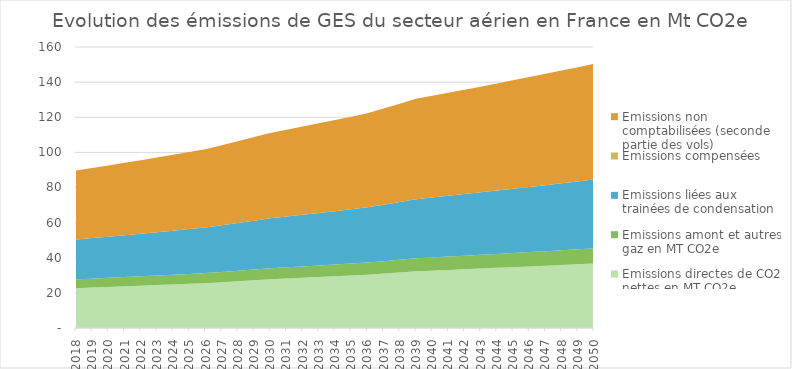
| Category | Emissions directes de CO2 nettes en MT CO2e | Emissions amont et autres gaz en MT CO2e | Emissions liées aux trainées de condensation | Emissions compensées | Emissions non comptabilisées (seconde partie des vols) |
|---|---|---|---|---|---|
| 2018.0 | 22.697 | 4.993 | 22.697 | 0 | 39.269 |
| 2019.0 | 23.035 | 5.078 | 23.081 | 0 | 39.898 |
| 2020.0 | 23.378 | 5.164 | 23.472 | 0 | 40.537 |
| 2021.0 | 23.726 | 5.251 | 23.869 | 0 | 41.186 |
| 2022.0 | 24.08 | 5.34 | 24.273 | 0 | 41.846 |
| 2023.0 | 24.438 | 5.431 | 24.684 | 0 | 42.516 |
| 2024.0 | 24.802 | 5.522 | 25.102 | 0 | 43.198 |
| 2025.0 | 25.172 | 5.616 | 25.527 | 0 | 43.89 |
| 2026.0 | 25.547 | 5.711 | 25.959 | 0 | 44.593 |
| 2027.0 | 26.081 | 5.842 | 26.556 | 0 | 45.576 |
| 2028.0 | 26.627 | 5.976 | 27.166 | 0 | 46.582 |
| 2029.0 | 27.184 | 6.114 | 27.79 | 0 | 47.61 |
| 2030.0 | 27.753 | 6.254 | 28.428 | 0 | 48.66 |
| 2031.0 | 28.167 | 6.36 | 28.91 | 0 | 49.44 |
| 2032.0 | 28.586 | 6.468 | 29.399 | 0 | 50.232 |
| 2033.0 | 29.012 | 6.577 | 29.897 | 0 | 51.037 |
| 2034.0 | 29.445 | 6.689 | 30.403 | 0 | 51.856 |
| 2035.0 | 29.883 | 6.802 | 30.918 | 0 | 52.687 |
| 2036.0 | 30.328 | 6.917 | 31.441 | 0 | 53.532 |
| 2037.0 | 30.963 | 7.076 | 32.163 | 0 | 54.713 |
| 2038.0 | 31.611 | 7.239 | 32.902 | 0 | 55.921 |
| 2039.0 | 32.272 | 7.405 | 33.658 | 0 | 57.155 |
| 2040.0 | 32.656 | 7.508 | 34.126 | 0 | 57.899 |
| 2041.0 | 33.044 | 7.612 | 34.601 | 0 | 58.653 |
| 2042.0 | 33.437 | 7.718 | 35.082 | 0 | 59.416 |
| 2043.0 | 33.834 | 7.826 | 35.571 | 0 | 60.19 |
| 2044.0 | 34.236 | 7.934 | 36.065 | 0 | 60.974 |
| 2045.0 | 34.643 | 8.045 | 36.567 | 0 | 61.768 |
| 2046.0 | 35.055 | 8.157 | 37.076 | 0 | 62.572 |
| 2047.0 | 35.471 | 8.27 | 37.591 | 0 | 63.387 |
| 2048.0 | 35.893 | 8.385 | 38.114 | 0 | 64.213 |
| 2049.0 | 36.319 | 8.502 | 38.645 | 0 | 65.05 |
| 2050.0 | 36.751 | 8.62 | 39.182 | 0 | 65.897 |